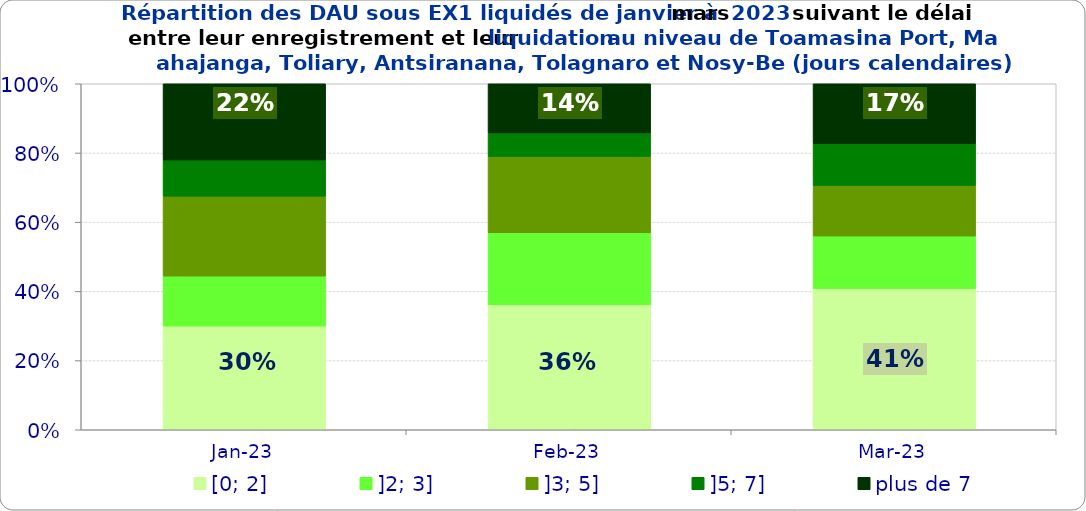
| Category | [0; 2] | ]2; 3] | ]3; 5] | ]5; 7] | plus de 7 |
|---|---|---|---|---|---|
| 2023-01-01 | 0.3 | 0.145 | 0.231 | 0.104 | 0.221 |
| 2023-02-01 | 0.362 | 0.208 | 0.221 | 0.068 | 0.142 |
| 2023-03-01 | 0.408 | 0.152 | 0.146 | 0.121 | 0.173 |